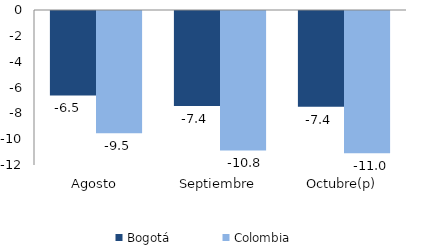
| Category | Bogotá | Colombia |
|---|---|---|
| Agosto | -6.542 | -9.47 |
| Septiembre | -7.352 | -10.792 |
| Octubre(p) | -7.409 | -11.005 |